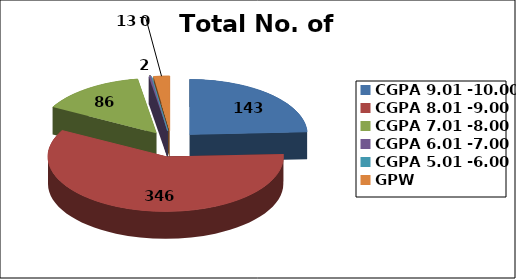
| Category | Total No. of Students |
|---|---|
| CGPA 9.01 -10.00 | 143 |
| CGPA 8.01 -9.00 | 346 |
| CGPA 7.01 -8.00 | 86 |
| CGPA 6.01 -7.00 | 2 |
| CGPA 5.01 -6.00 | 0 |
| GPW | 13 |